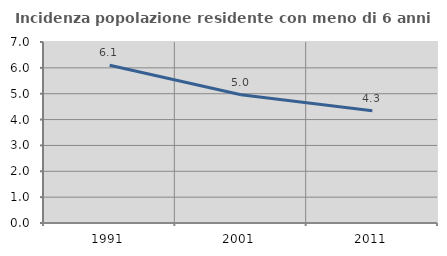
| Category | Incidenza popolazione residente con meno di 6 anni |
|---|---|
| 1991.0 | 6.102 |
| 2001.0 | 4.959 |
| 2011.0 | 4.342 |